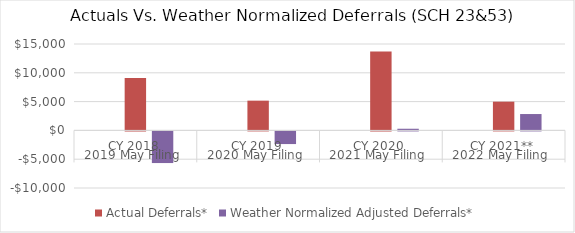
| Category | Residential: SCH 23&53 | Actual Deferrals* | Weather Normalized Adjusted Deferrals* |
|---|---|---|---|
| 0 |  | 9092.946 | -5495.228 |
| 1 |  | 5164.772 | -2198.57 |
| 2 |  | 13687.044 | 286.015 |
| 3 |  | 4987.461 | 2840.635 |